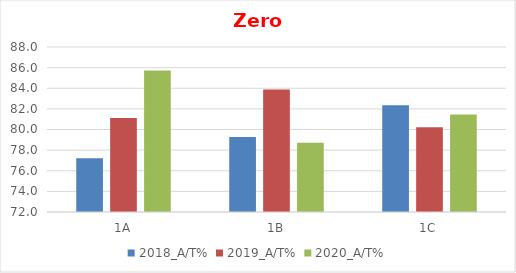
| Category | 2018_A/T% | 2019_A/T% | 2020_A/T% |
|---|---|---|---|
| 1A | 77.215 | 81.111 | 85.714 |
| 1B | 79.268 | 83.871 | 78.723 |
| 1C | 82.353 | 80.208 | 81.443 |